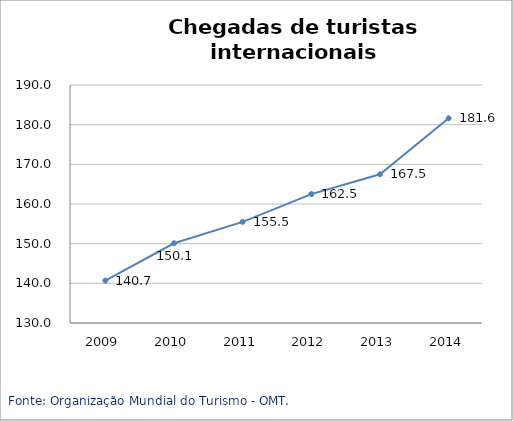
| Category | Américas |
|---|---|
| 2009.0 | 140.7 |
| 2010.0 | 150.1 |
| 2011.0 | 155.5 |
| 2012.0 | 162.5 |
| 2013.0 | 167.5 |
| 2014.0 | 181.6 |